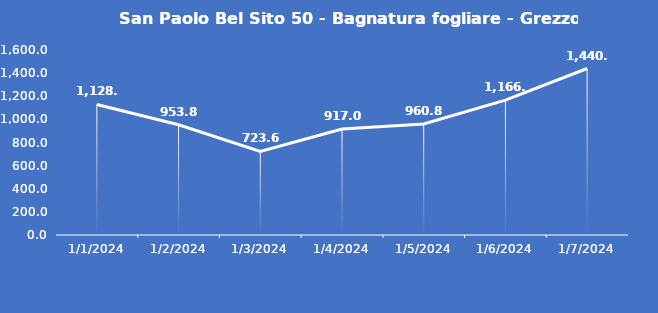
| Category | San Paolo Bel Sito 50 - Bagnatura fogliare - Grezzo (min) |
|---|---|
| 1/1/24 | 1128.7 |
| 1/2/24 | 953.8 |
| 1/3/24 | 723.6 |
| 1/4/24 | 917 |
| 1/5/24 | 960.8 |
| 1/6/24 | 1166.9 |
| 1/7/24 | 1440 |